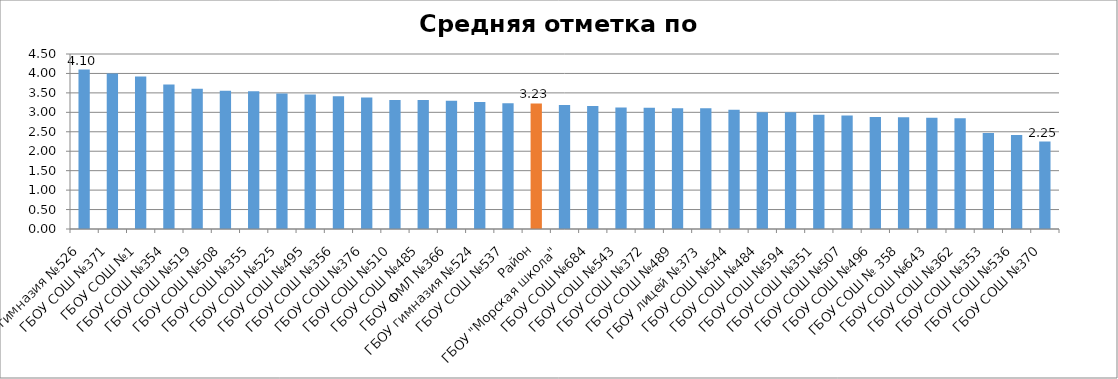
| Category | Средняя отметка по ОУ |
|---|---|
| ГБОУ гимназия №526 | 4.099 |
| ГБОУ СОШ №371 | 4 |
| ГБОУ СОШ №1 | 3.921 |
| ГБОУ СОШ №354 | 3.714 |
| ГБОУ СОШ №519 | 3.607 |
| ГБОУ СОШ №508 | 3.558 |
| ГБОУ СОШ №355 | 3.541 |
| ГБОУ СОШ №525 | 3.486 |
| ГБОУ СОШ №495 | 3.457 |
| ГБОУ СОШ №356 | 3.417 |
| ГБОУ СОШ №376 | 3.382 |
| ГБОУ СОШ №510 | 3.318 |
| ГБОУ СОШ №485 | 3.317 |
| ГБОУ ФМЛ №366 | 3.3 |
| ГБОУ гимназия №524 | 3.263 |
| ГБОУ СОШ №537 | 3.233 |
| Район | 3.229 |
| ГБОУ "Морская школа" | 3.191 |
| ГБОУ СОШ №684 | 3.163 |
| ГБОУ СОШ №543 | 3.122 |
| ГБОУ СОШ №372 | 3.12 |
| ГБОУ СОШ №489 | 3.106 |
| ГБОУ лицей №373 | 3.105 |
| ГБОУ СОШ №544 | 3.065 |
| ГБОУ СОШ №484 | 3 |
| ГБОУ СОШ №594 | 3 |
| ГБОУ СОШ №351 | 2.938 |
| ГБОУ СОШ №507 | 2.921 |
| ГБОУ СОШ №496 | 2.882 |
| ГБОУ СОШ № 358 | 2.875 |
| ГБОУ СОШ №643 | 2.862 |
| ГБОУ СОШ №362 | 2.846 |
| ГБОУ СОШ №353 | 2.467 |
| ГБОУ СОШ №536 | 2.418 |
| ГБОУ СОШ №370 | 2.25 |